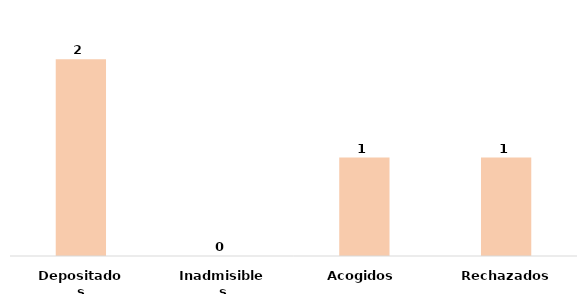
| Category | Series 0 |
|---|---|
| Depositados | 2 |
| Inadmisibles | 0 |
| Acogidos | 1 |
| Rechazados | 1 |